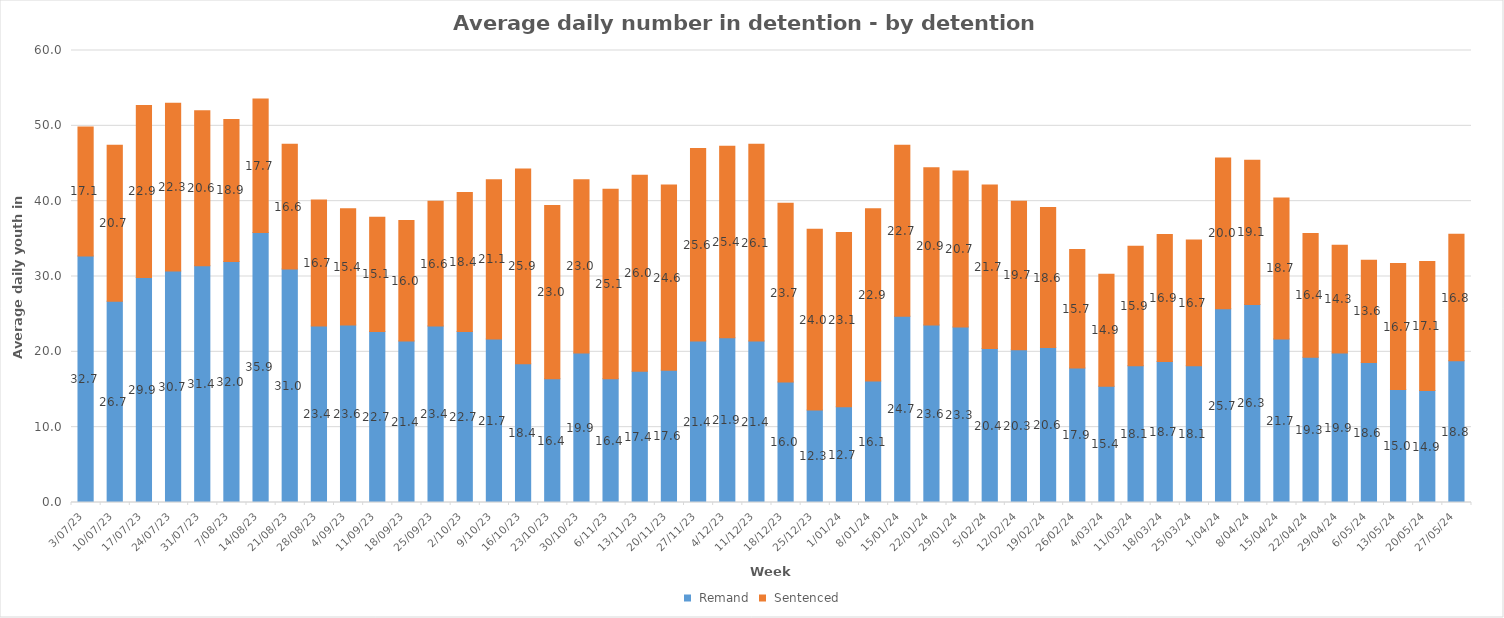
| Category |  Remand |  Sentenced |
|---|---|---|
| 3/07/23 | 32.714 | 17.143 |
| 10/07/23 | 26.714 | 20.714 |
| 17/07/23 | 29.857 | 22.857 |
| 24/07/23 | 30.714 | 22.286 |
| 31/07/23 | 31.429 | 20.571 |
| 7/08/23 | 32 | 18.857 |
| 14/08/23 | 35.857 | 17.714 |
| 21/08/23 | 31 | 16.571 |
| 28/08/23 | 23.429 | 16.714 |
| 4/09/23 | 23.571 | 15.429 |
| 11/09/23 | 22.714 | 15.143 |
| 18/09/23 | 21.429 | 16 |
| 25/09/23 | 23.429 | 16.571 |
| 2/10/23 | 22.714 | 18.429 |
| 9/10/23 | 21.714 | 21.143 |
| 16/10/23 | 18.429 | 25.857 |
| 23/10/23 | 16.429 | 23 |
| 30/10/23 | 19.857 | 23 |
| 6/11/23 | 16.429 | 25.143 |
| 13/11/23 | 17.429 | 26 |
| 20/11/23 | 17.571 | 24.571 |
| 27/11/23 | 21.429 | 25.571 |
| 4/12/23 | 21.857 | 25.429 |
| 11/12/23 | 21.429 | 26.143 |
| 18/12/23 | 16 | 23.714 |
| 25/12/23 | 12.286 | 24 |
| 1/01/24 | 12.714 | 23.143 |
| 8/01/24 | 16.143 | 22.857 |
| 15/01/24 | 24.714 | 22.714 |
| 22/01/24 | 23.571 | 20.857 |
| 29/01/24 | 23.286 | 20.714 |
| 5/02/24 | 20.429 | 21.714 |
| 12/02/24 | 20.286 | 19.714 |
| 19/02/24 | 20.571 | 18.571 |
| 26/02/24 | 17.857 | 15.714 |
| 4/03/24 | 15.429 | 14.857 |
| 11/03/24 | 18.143 | 15.857 |
| 18/03/24 | 18.714 | 16.857 |
| 25/03/24 | 18.143 | 16.714 |
| 1/04/24 | 25.714 | 20 |
| 8/04/24 | 26.286 | 19.143 |
| 15/04/24 | 21.714 | 18.714 |
| 22/04/24 | 19.286 | 16.429 |
| 29/04/24 | 19.857 | 14.286 |
| 6/05/24 | 18.571 | 13.571 |
| 13/05/24 | 15 | 16.714 |
| 20/05/24 | 14.857 | 17.143 |
| 27/05/24 | 18.8 | 16.8 |